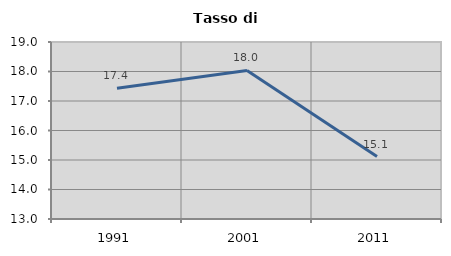
| Category | Tasso di disoccupazione   |
|---|---|
| 1991.0 | 17.436 |
| 2001.0 | 18.036 |
| 2011.0 | 15.116 |